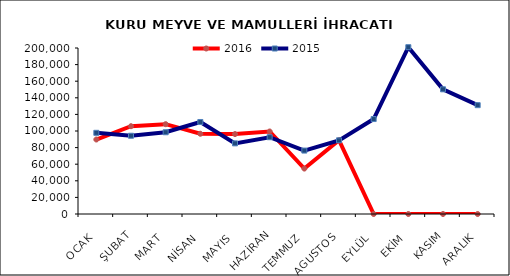
| Category | 2016 | 2015 |
|---|---|---|
| OCAK | 89746.165 | 97812.898 |
| ŞUBAT | 105773.292 | 94271.043 |
| MART | 108213.323 | 98490.356 |
| NİSAN | 96672.681 | 110854.416 |
| MAYIS | 96288.852 | 85102.735 |
| HAZİRAN | 99410.352 | 92532.187 |
| TEMMUZ | 54754.656 | 76412.843 |
| AGUSTOS | 88971.986 | 88757.403 |
| EYLÜL | 0 | 114412.514 |
| EKİM | 0 | 200968.613 |
| KASIM | 0 | 150217.195 |
| ARALIK | 0 | 131132.585 |